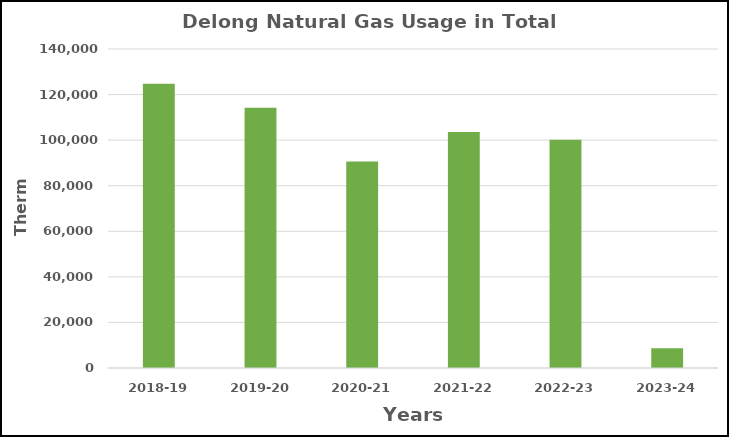
| Category | Series 0 |
|---|---|
| 2018-19 | 124711 |
| 2019-20 | 114204 |
| 2020-21 | 90604 |
| 2021-22 | 103620 |
| 2022-23 | 100162 |
| 2023-24 | 8709 |